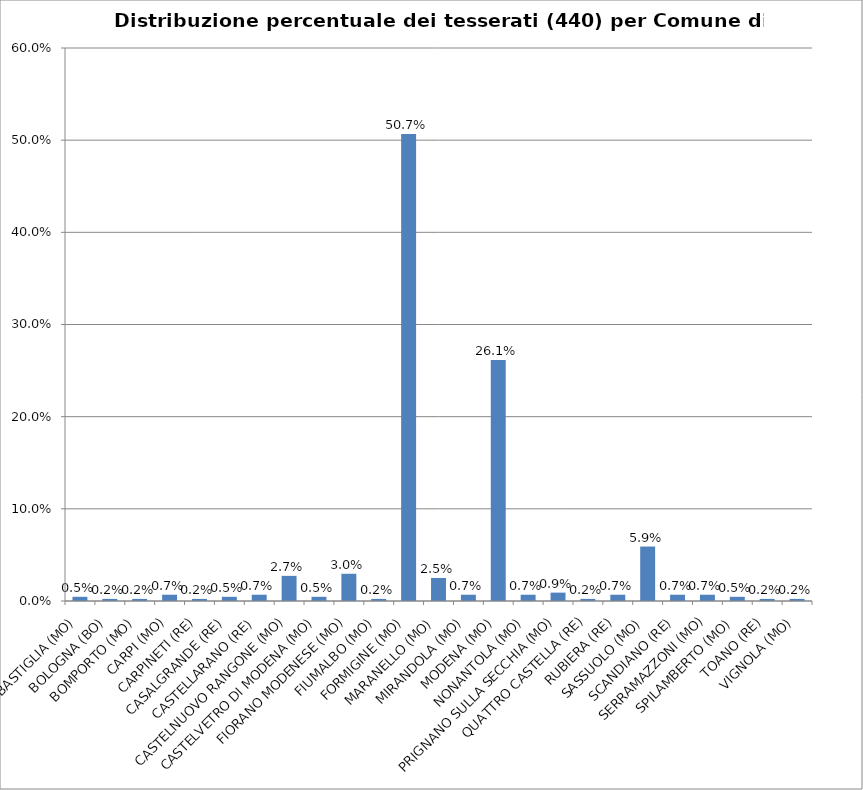
| Category | % Tesserati |
|---|---|
| BASTIGLIA (MO) | 0.005 |
| BOLOGNA (BO) | 0.002 |
| BOMPORTO (MO) | 0.002 |
| CARPI (MO) | 0.007 |
| CARPINETI (RE) | 0.002 |
| CASALGRANDE (RE) | 0.005 |
| CASTELLARANO (RE) | 0.007 |
| CASTELNUOVO RANGONE (MO) | 0.027 |
| CASTELVETRO DI MODENA (MO) | 0.005 |
| FIORANO MODENESE (MO) | 0.03 |
| FIUMALBO (MO) | 0.002 |
| FORMIGINE (MO) | 0.507 |
| MARANELLO (MO) | 0.025 |
| MIRANDOLA (MO) | 0.007 |
| MODENA (MO) | 0.261 |
| NONANTOLA (MO) | 0.007 |
| PRIGNANO SULLA SECCHIA (MO) | 0.009 |
| QUATTRO CASTELLA (RE) | 0.002 |
| RUBIERA (RE) | 0.007 |
| SASSUOLO (MO) | 0.059 |
| SCANDIANO (RE) | 0.007 |
| SERRAMAZZONI (MO) | 0.007 |
| SPILAMBERTO (MO) | 0.005 |
| TOANO (RE) | 0.002 |
| VIGNOLA (MO) | 0.002 |